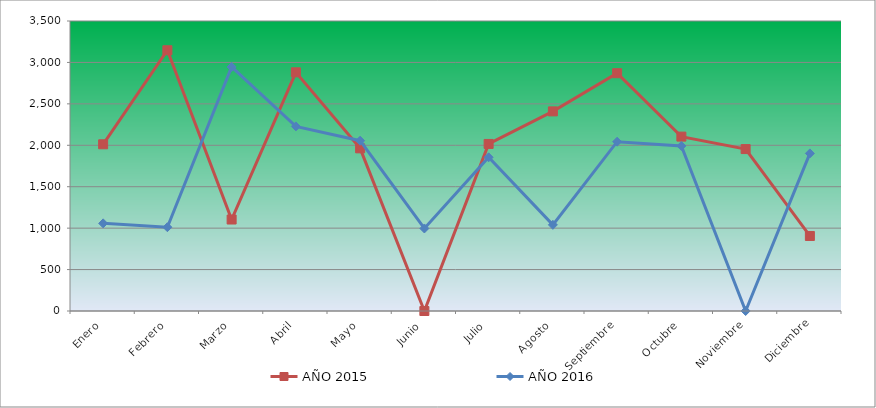
| Category | AÑO 2015 | AÑO 2016 |
|---|---|---|
| Enero | 2011.954 | 1057.622 |
| Febrero | 3146.826 | 1011.415 |
| Marzo | 1103.995 | 2945.67 |
| Abril | 2880.613 | 2228.193 |
| Mayo | 1962.945 | 2055.706 |
| Junio | 0 | 996.013 |
| Julio | 2016.275 | 1854.916 |
| Agosto | 2409.189 | 1039.652 |
| Septiembre | 2869.827 | 2043.366 |
| Octubre | 2104.813 | 1992.025 |
| Noviembre | 1954.303 | 0 |
| Diciembre | 905.379 | 1902.179 |